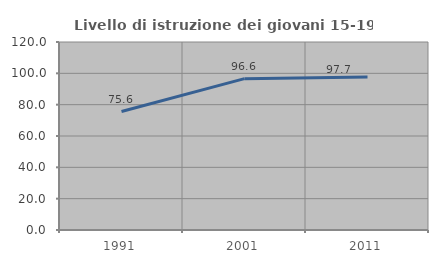
| Category | Livello di istruzione dei giovani 15-19 anni |
|---|---|
| 1991.0 | 75.635 |
| 2001.0 | 96.622 |
| 2011.0 | 97.674 |